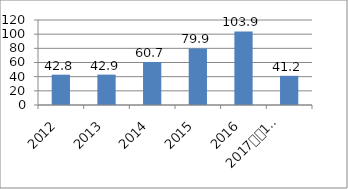
| Category | Series 0 |
|---|---|
| 2012 | 42.8 |
| 2013 | 42.9 |
| 2014 | 60.7 |
| 2015 | 79.9 |
| 2016 | 103.9 |
| 2017
1-yarim yillik | 41.2 |